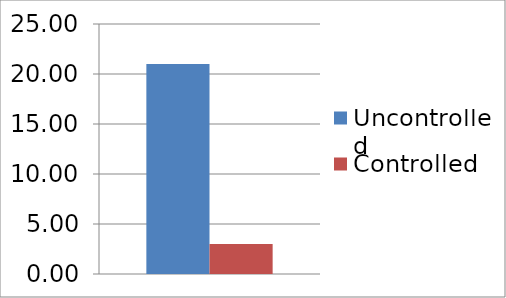
| Category | Uncontrolled | Controlled |
|---|---|---|
| 0 | 21 | 3 |